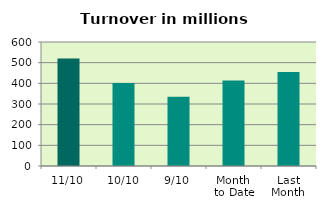
| Category | Series 0 |
|---|---|
| 11/10 | 520.637 |
| 10/10 | 401.527 |
| 9/10 | 335.187 |
| Month 
to Date | 413.929 |
| Last
Month | 454.566 |